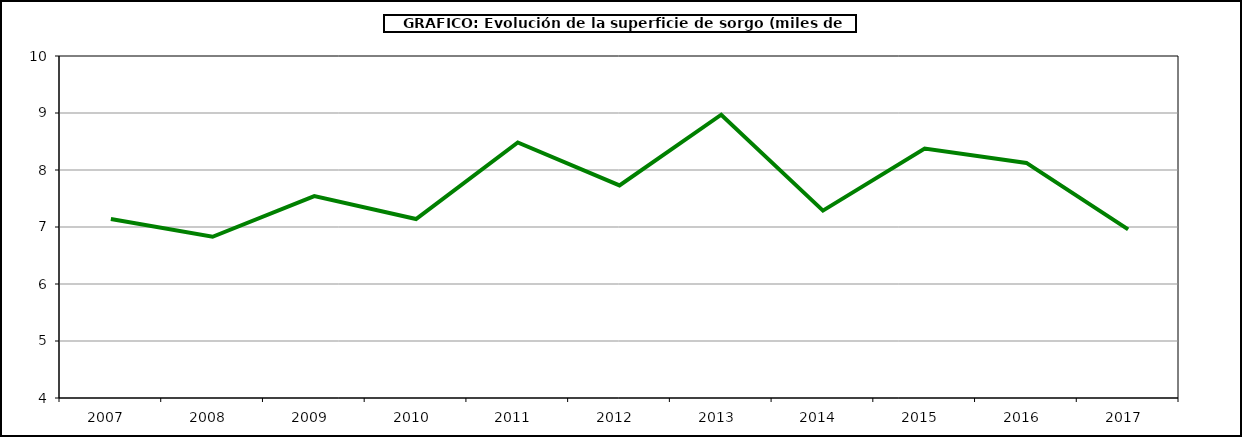
| Category | Superficie |
|---|---|
| 2007.0 | 7.14 |
| 2008.0 | 6.829 |
| 2009.0 | 7.541 |
| 2010.0 | 7.14 |
| 2011.0 | 8.482 |
| 2012.0 | 7.729 |
| 2013.0 | 8.97 |
| 2014.0 | 7.288 |
| 2015.0 | 8.375 |
| 2016.0 | 8.124 |
| 2017.0 | 6.958 |